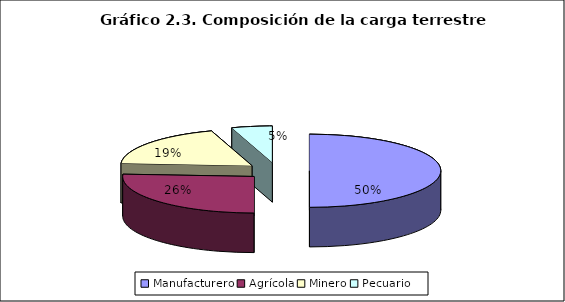
| Category | Series 0 |
|---|---|
| Manufacturero | 0.5 |
| Agrícola | 0.26 |
| Minero | 0.19 |
| Pecuario | 0.05 |